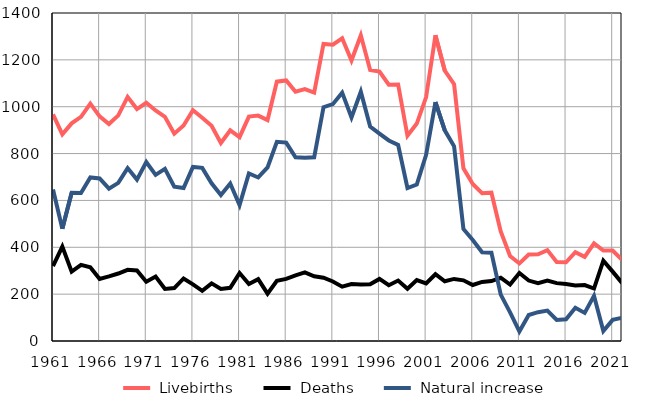
| Category |  Livebirths |  Deaths |  Natural increase |
|---|---|---|---|
| 1961.0 | 967 | 320 | 647 |
| 1962.0 | 882 | 403 | 479 |
| 1963.0 | 929 | 296 | 633 |
| 1964.0 | 957 | 325 | 632 |
| 1965.0 | 1013 | 315 | 698 |
| 1966.0 | 959 | 265 | 694 |
| 1967.0 | 926 | 276 | 650 |
| 1968.0 | 963 | 288 | 675 |
| 1969.0 | 1042 | 304 | 738 |
| 1970.0 | 990 | 301 | 689 |
| 1971.0 | 1017 | 253 | 764 |
| 1972.0 | 984 | 275 | 709 |
| 1973.0 | 957 | 222 | 735 |
| 1974.0 | 885 | 226 | 659 |
| 1975.0 | 920 | 267 | 653 |
| 1976.0 | 985 | 242 | 743 |
| 1977.0 | 953 | 214 | 739 |
| 1978.0 | 919 | 246 | 673 |
| 1979.0 | 845 | 222 | 623 |
| 1980.0 | 899 | 227 | 672 |
| 1981.0 | 870 | 290 | 580 |
| 1982.0 | 958 | 243 | 715 |
| 1983.0 | 962 | 264 | 698 |
| 1984.0 | 943 | 202 | 741 |
| 1985.0 | 1107 | 257 | 850 |
| 1986.0 | 1112 | 265 | 847 |
| 1987.0 | 1064 | 280 | 784 |
| 1988.0 | 1075 | 293 | 782 |
| 1989.0 | 1060 | 276 | 784 |
| 1990.0 | 1268 | 270 | 998 |
| 1991.0 | 1265 | 254 | 1011 |
| 1992.0 | 1292 | 232 | 1060 |
| 1993.0 | 1197 | 243 | 954 |
| 1994.0 | 1305 | 241 | 1064 |
| 1995.0 | 1157 | 242 | 915 |
| 1996.0 | 1150 | 265 | 885 |
| 1997.0 | 1094 | 238 | 856 |
| 1998.0 | 1095 | 258 | 837 |
| 1999.0 | 876 | 223 | 653 |
| 2000.0 | 928 | 260 | 668 |
| 2001.0 | 1041 | 246 | 795 |
| 2002.0 | 1305 | 285 | 1020 |
| 2003.0 | 1154 | 255 | 899 |
| 2004.0 | 1096 | 265 | 831 |
| 2005.0 | 737 | 259 | 478 |
| 2006.0 | 670 | 239 | 431 |
| 2007.0 | 631 | 252 | 379 |
| 2008.0 | 633 | 256 | 377 |
| 2009.0 | 468 | 270 | 198 |
| 2010.0 | 363 | 241 | 122 |
| 2011.0 | 331 | 290 | 41 |
| 2012.0 | 369 | 258 | 111 |
| 2013.0 | 370 | 247 | 123 |
| 2014.0 | 388 | 258 | 130 |
| 2015.0 | 337 | 247 | 90 |
| 2016.0 | 336 | 243 | 93 |
| 2017.0 | 379 | 237 | 142 |
| 2018.0 | 359 | 239 | 120 |
| 2019.0 | 417 | 224 | 193 |
| 2020.0 | 386 | 343 | 43 |
| 2021.0 | 386 | 296 | 90 |
| 2022.0 | 347 | 248 | 99 |